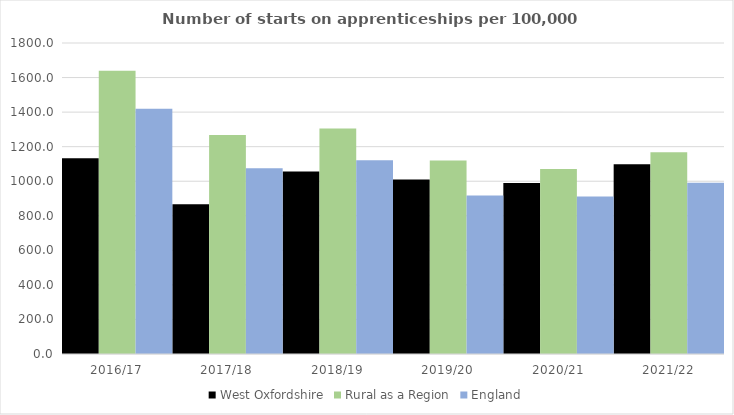
| Category | West Oxfordshire | Rural as a Region | England |
|---|---|---|---|
| 2016/17 | 1133 | 1638.789 | 1420 |
| 2017/18 | 867 | 1267.474 | 1075 |
| 2018/19 | 1056 | 1304.57 | 1122 |
| 2019/20 | 1010 | 1119.662 | 918 |
| 2020/21 | 990 | 1070.748 | 912 |
| 2021/22 | 1098 | 1167.68 | 991 |